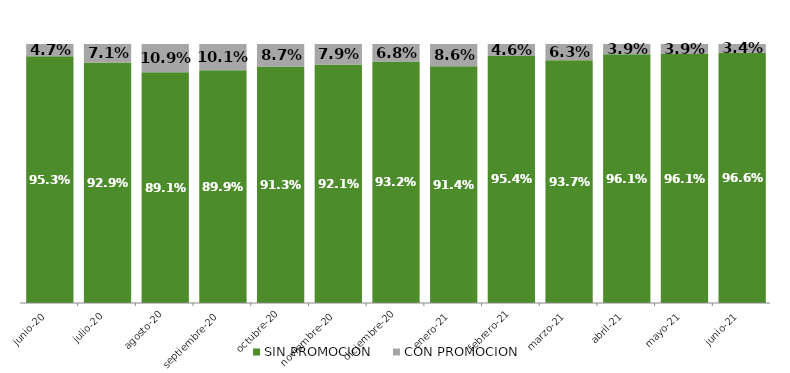
| Category | SIN PROMOCION   | CON PROMOCION   |
|---|---|---|
| 2020-06-01 | 0.953 | 0.047 |
| 2020-07-01 | 0.929 | 0.071 |
| 2020-08-01 | 0.891 | 0.109 |
| 2020-09-01 | 0.899 | 0.101 |
| 2020-10-01 | 0.913 | 0.087 |
| 2020-11-01 | 0.921 | 0.079 |
| 2020-12-01 | 0.932 | 0.068 |
| 2021-01-01 | 0.914 | 0.086 |
| 2021-02-01 | 0.954 | 0.046 |
| 2021-03-01 | 0.937 | 0.063 |
| 2021-04-01 | 0.961 | 0.039 |
| 2021-05-01 | 0.961 | 0.039 |
| 2021-06-01 | 0.966 | 0.034 |